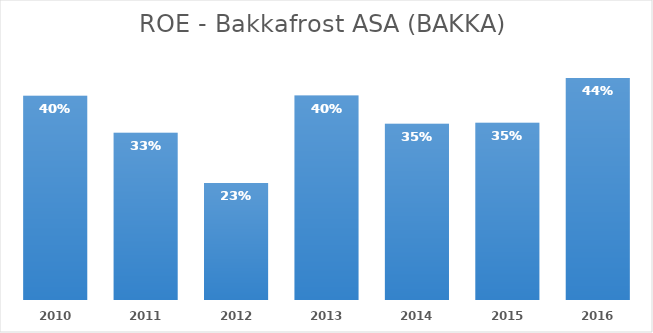
| Category | Series 0 |
|---|---|
| 2010.0 | 0.402 |
| 2011.0 | 0.329 |
| 2012.0 | 0.231 |
| 2013.0 | 0.402 |
| 2014.0 | 0.347 |
| 2015.0 | 0.349 |
| 2016.0 | 0.437 |